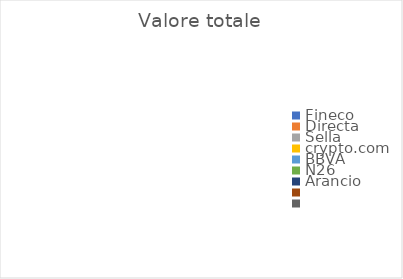
| Category | Valore totale |
|---|---|
| Fineco | 0 |
| Directa | 0 |
| Sella | 0 |
| crypto.com | 0 |
| BBVA | 0 |
| N26 | 0 |
| Arancio | 0 |